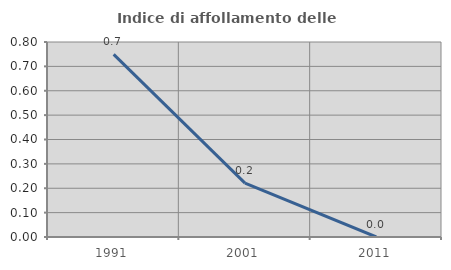
| Category | Indice di affollamento delle abitazioni  |
|---|---|
| 1991.0 | 0.749 |
| 2001.0 | 0.221 |
| 2011.0 | 0 |